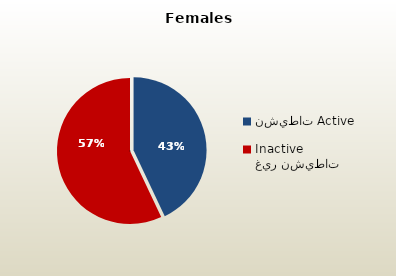
| Category | الاناث القطريات  Qatari Females |
|---|---|
| نشيطات Active | 47901 |
| غير نشيطات Inactive | 63572 |